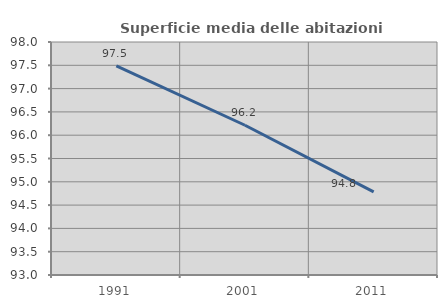
| Category | Superficie media delle abitazioni occupate |
|---|---|
| 1991.0 | 97.489 |
| 2001.0 | 96.213 |
| 2011.0 | 94.782 |